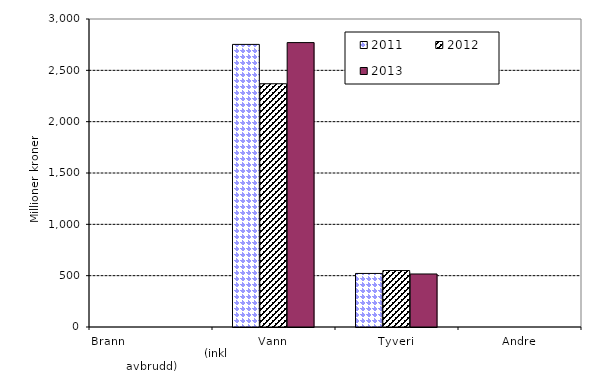
| Category | 2011 | 2012 | 2013 |
|---|---|---|---|
| Brann                                                       (inkl avbrudd) | 0 | 0 | 0 |
| Vann | 2752.651 | 2369.36 | 2770.188 |
| Tyveri | 521.586 | 549.974 | 516.433 |
| Andre | 0 | 0 | 0 |